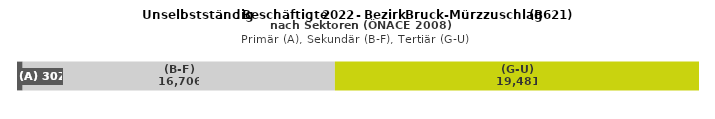
| Category | (A) | (B-F) | (G-U) |
|---|---|---|---|
| 0 | 302 | 16706 | 19481 |